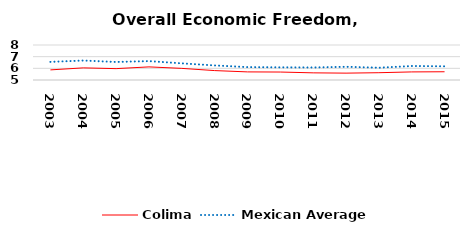
| Category | Colima | Mexican Average  |
|---|---|---|
| 2003.0 | 5.867 | 6.552 |
| 2004.0 | 6.039 | 6.668 |
| 2005.0 | 5.975 | 6.546 |
| 2006.0 | 6.124 | 6.619 |
| 2007.0 | 5.996 | 6.428 |
| 2008.0 | 5.808 | 6.248 |
| 2009.0 | 5.695 | 6.106 |
| 2010.0 | 5.682 | 6.086 |
| 2011.0 | 5.612 | 6.074 |
| 2012.0 | 5.589 | 6.134 |
| 2013.0 | 5.625 | 6.054 |
| 2014.0 | 5.694 | 6.2 |
| 2015.0 | 5.707 | 6.174 |